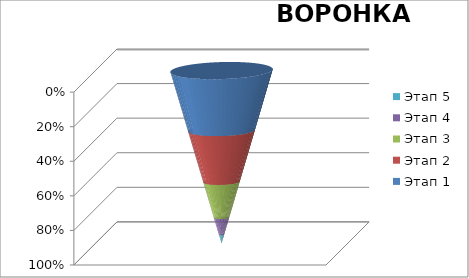
| Category | Этап 1 | Этап 2 | Этап 3 | Этап 4 | Этап 5 |
|---|---|---|---|---|---|
| 0 | 3500 | 3000 | 2100 | 1000 | 500 |